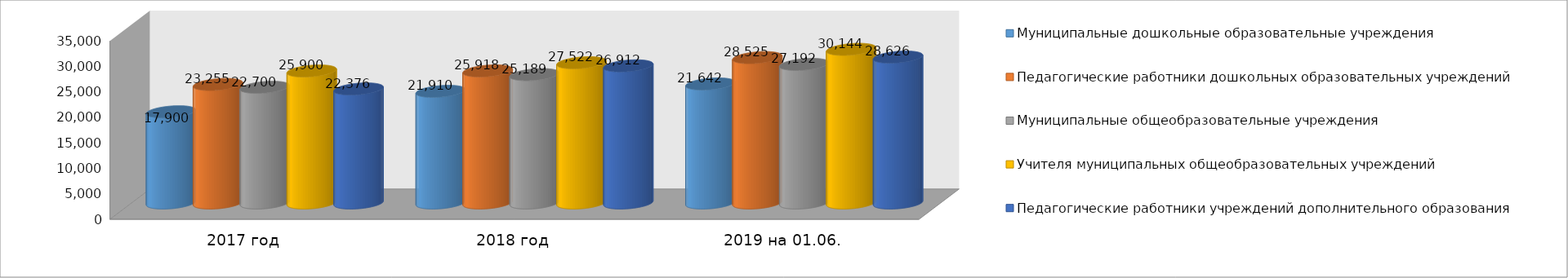
| Category | Муниципальные дошкольные образовательные учреждения | Педагогические работники дошкольных образовательных учреждений | Муниципальные общеобразовательные учреждения | Учителя муниципальных общеобразовательных учреждений | Педагогические работники учреждений дополнительного образования |
|---|---|---|---|---|---|
| 2017 год | 17900 | 23255 | 22700 | 25900 | 22376 |
| 2018 год | 21910 | 25918 | 25189 | 27522 | 26912 |
| 2019 на 01.06. | 23356 | 28525 | 27192 | 30144 | 28626 |